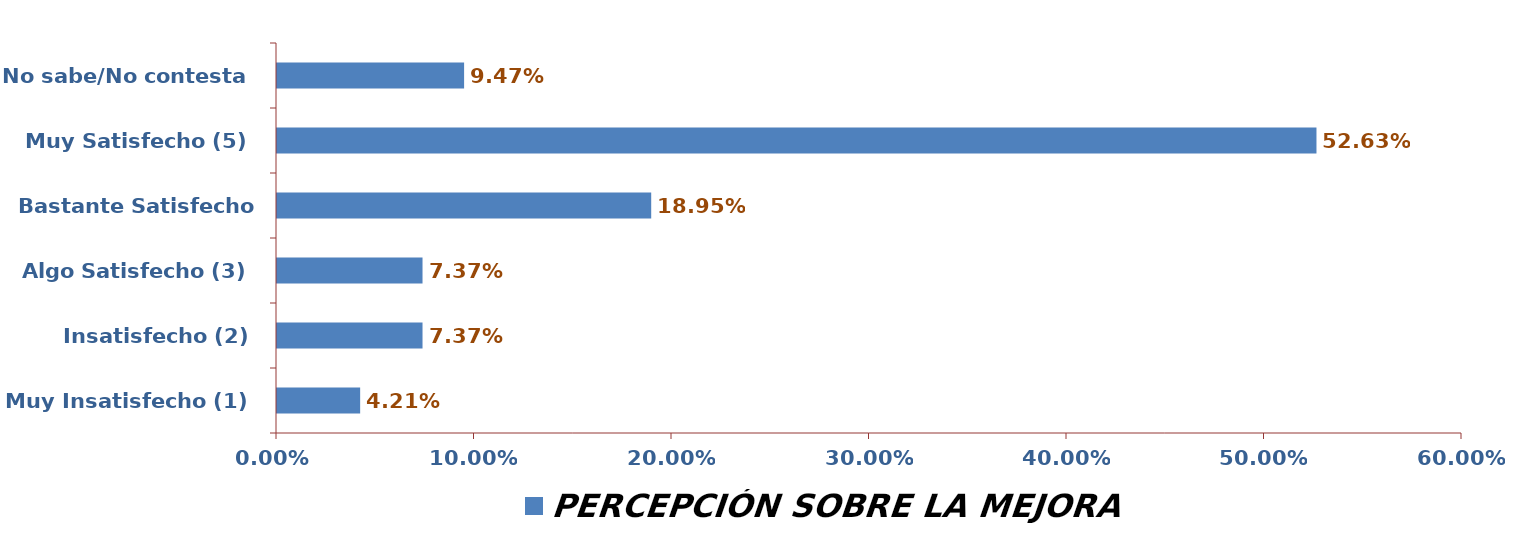
| Category | PERCEPCIÓN SOBRE LA MEJORA |
|---|---|
| Muy Insatisfecho (1) | 0.042 |
| Insatisfecho (2) | 0.074 |
| Algo Satisfecho (3) | 0.074 |
| Bastante Satisfecho (4) | 0.189 |
| Muy Satisfecho (5) | 0.526 |
| No sabe/No contesta | 0.095 |